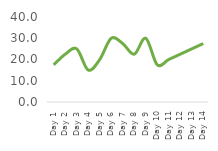
| Category | Inventory Turns |
|---|---|
| Day 1 | 17.5 |
| Day 2 | 22.5 |
| Day 3 | 25 |
| Day 4 | 15 |
| Day 5 | 20 |
| Day 6 | 30 |
| Day 7 | 27.5 |
| Day 8 | 22.5 |
| Day 9 | 30 |
| Day 10 | 17.5 |
| Day 11 | 20 |
| Day 12 | 22.5 |
| Day 13 | 25 |
| Day 14 | 27.5 |